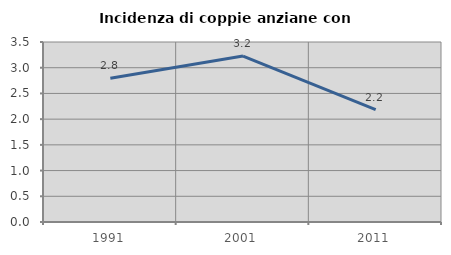
| Category | Incidenza di coppie anziane con figli |
|---|---|
| 1991.0 | 2.793 |
| 2001.0 | 3.226 |
| 2011.0 | 2.186 |